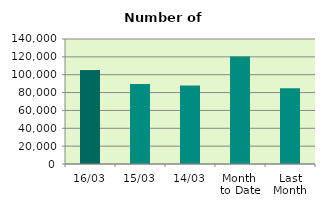
| Category | Series 0 |
|---|---|
| 16/03 | 105338 |
| 15/03 | 89590 |
| 14/03 | 87864 |
| Month 
to Date | 120346.667 |
| Last
Month | 84726.4 |